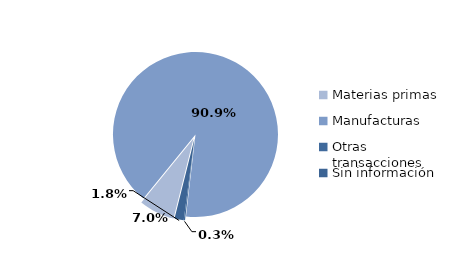
| Category | Series 0 |
|---|---|
| Materias primas | 2341.003 |
| Manufacturas | 30385.888 |
| Otras transacciones | 84.322 |
| Sin información | 600.946 |